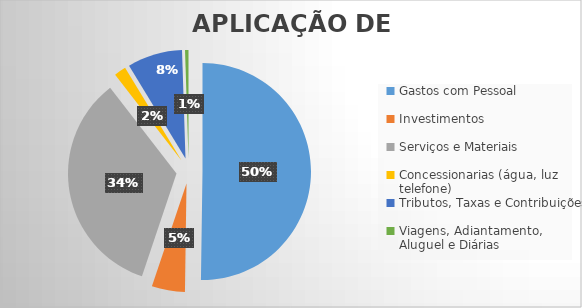
| Category | Series 0 |
|---|---|
| Gastos com Pessoal | 0.502 |
| Investimentos | 0.049 |
| Serviços e Materiais | 0.344 |
| Concessionarias (água, luz telefone) | 0.018 |
| Tributos, Taxas e Contribuições | 0.082 |
| Viagens, Adiantamento, Aluguel e Diárias | 0.005 |